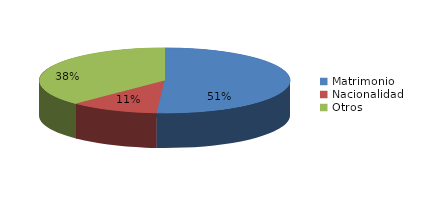
| Category | Series 0 |
|---|---|
| Matrimonio | 672 |
| Nacionalidad | 151 |
| Otros | 495 |